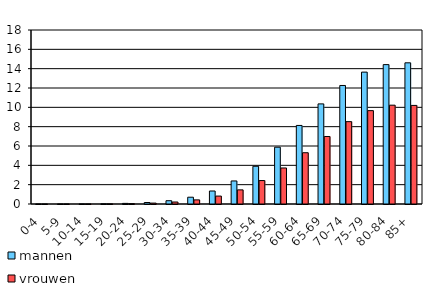
| Category | mannen | vrouwen |
|---|---|---|
| 0-4 | 0.001 | 0.001 |
| 5-9 | 0.003 | 0.002 |
| 10-14 | 0.009 | 0.006 |
| 15-19 | 0.025 | 0.015 |
| 20-24 | 0.065 | 0.039 |
| 25-29 | 0.154 | 0.093 |
| 30-34 | 0.34 | 0.206 |
| 35-39 | 0.702 | 0.426 |
| 40-44 | 1.344 | 0.819 |
| 45-49 | 2.384 | 1.462 |
| 50-54 | 3.903 | 2.425 |
| 55-59 | 5.876 | 3.727 |
| 60-64 | 8.126 | 5.304 |
| 65-69 | 10.355 | 6.984 |
| 70-74 | 12.261 | 8.519 |
| 75-79 | 13.643 | 9.658 |
| 80-84 | 14.419 | 10.223 |
| 85+ | 14.605 | 10.199 |